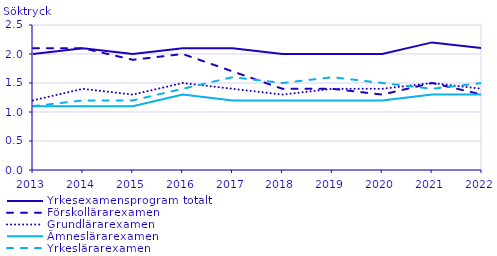
| Category | Yrkesexamensprogram totalt | Förskollärarexamen                                 | Grundlärarexamen                                   | Ämneslärarexamen                                   | Yrkeslärarexamen                                   |
|---|---|---|---|---|---|
| 2013.0 | 2 | 2.1 | 1.2 | 1.1 | 1.1 |
| 2014.0 | 2.1 | 2.1 | 1.4 | 1.1 | 1.2 |
| 2015.0 | 2 | 1.9 | 1.3 | 1.1 | 1.2 |
| 2016.0 | 2.1 | 2 | 1.5 | 1.3 | 1.4 |
| 2017.0 | 2.1 | 1.7 | 1.4 | 1.2 | 1.6 |
| 2018.0 | 2 | 1.4 | 1.3 | 1.2 | 1.5 |
| 2019.0 | 2 | 1.4 | 1.4 | 1.2 | 1.6 |
| 2020.0 | 2 | 1.3 | 1.4 | 1.2 | 1.5 |
| 2021.0 | 2.2 | 1.5 | 1.5 | 1.3 | 1.4 |
| 2022.0 | 2.1 | 1.3 | 1.4 | 1.3 | 1.5 |